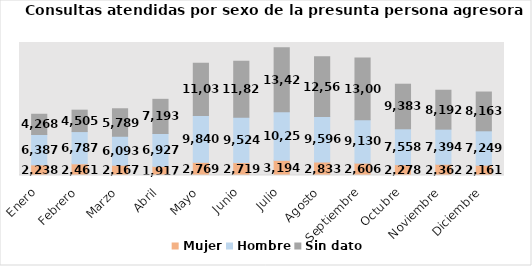
| Category | Mujer | Hombre | Sin dato |
|---|---|---|---|
| Enero | 2238 | 6387 | 4268 |
| Febrero | 2461 | 6787 | 4505 |
| Marzo | 2167 | 6093 | 5789 |
| Abril | 1917 | 6927 | 7193 |
| Mayo | 2769 | 9840 | 11035 |
| Junio | 2719 | 9524 | 11829 |
| Julio | 3194 | 10251 | 13424 |
| Agosto | 2833 | 9596 | 12561 |
| Septiembre | 2606 | 9130 | 13008 |
| Octubre | 2278 | 7558 | 9383 |
| Noviembre | 2362 | 7394 | 8192 |
| Diciembre | 2161 | 7249 | 8163 |